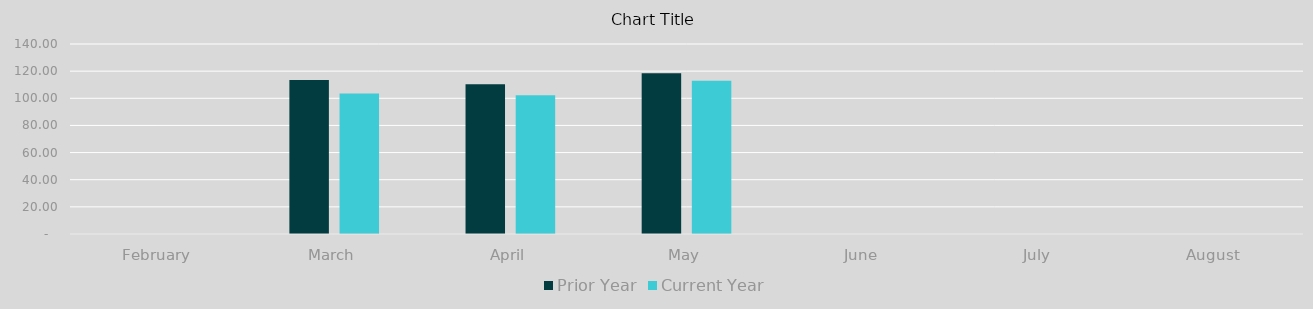
| Category | Prior Year | Current Year |
|---|---|---|
| February | 0 | 0 |
| March | 113.435 | 103.589 |
| April | 110.378 | 102.234 |
| May | 118.45 | 112.97 |
| June | 0 | 0 |
| July | 0 | 0 |
| August | 0 | 0 |